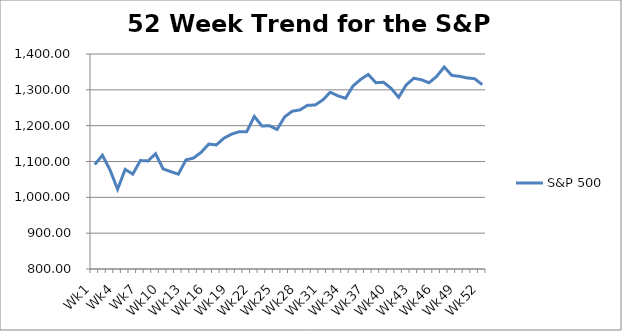
| Category | S&P 500 |
|---|---|
| Wk1 | 1091.6 |
| Wk2 | 1117.51 |
| Wk3 | 1076.76 |
| Wk4 | 1022.58 |
| Wk5 | 1077.96 |
| Wk6 | 1064.88 |
| Wk7 | 1102.66 |
| Wk8 | 1101.6 |
| Wk9 | 1121.64 |
| Wk10 | 1079.25 |
| Wk11 | 1071.69 |
| Wk12 | 1064.59 |
| Wk13 | 1104.51 |
| Wk14 | 1109.55 |
| Wk15 | 1125.59 |
| Wk16 | 1148.67 |
| Wk17 | 1146.24 |
| Wk18 | 1165.15 |
| Wk19 | 1176.19 |
| Wk20 | 1183.08 |
| Wk21 | 1183.26 |
| Wk22 | 1225.85 |
| Wk23 | 1199.21 |
| Wk24 | 1199.73 |
| Wk25 | 1189.4 |
| Wk26 | 1224.71 |
| Wk27 | 1240.4 |
| Wk28 | 1243.91 |
| Wk29 | 1256.77 |
| Wk30 | 1257.64 |
| Wk31 | 1271.5 |
| Wk32 | 1293.24 |
| Wk33 | 1283.35 |
| Wk34 | 1276.34 |
| Wk35 | 1310.87 |
| Wk36 | 1329.15 |
| Wk37 | 1343.01 |
| Wk38 | 1319.88 |
| Wk39 | 1321.15 |
| Wk40 | 1304.28 |
| Wk41 | 1279.21 |
| Wk42 | 1313.8 |
| Wk43 | 1332.41 |
| Wk44 | 1328.17 |
| Wk45 | 1319.68 |
| Wk46 | 1337.38 |
| Wk47 | 1363.61 |
| Wk48 | 1340.2 |
| Wk49 | 1337.77 |
| Wk50 | 1333.27 |
| Wk51 | 1331.1 |
| Wk52 | 1314.55 |